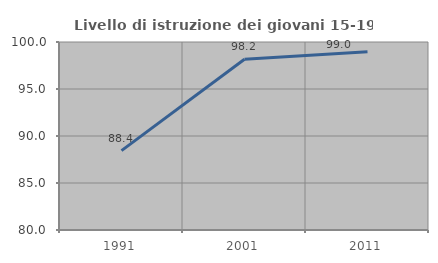
| Category | Livello di istruzione dei giovani 15-19 anni |
|---|---|
| 1991.0 | 88.448 |
| 2001.0 | 98.167 |
| 2011.0 | 98.969 |